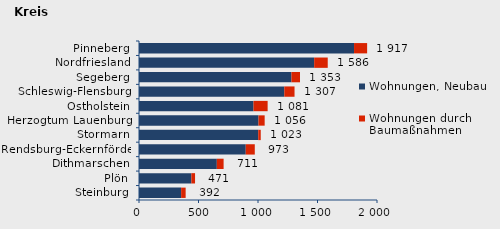
| Category | Wohnungen, Neubau | Wohnungen durch Baumaßnahmen | Series 2 |
|---|---|---|---|
| Steinburg | 354 | 38 | 392 |
| Plön | 440 | 31 | 471 |
| Dithmarschen | 654 | 57 | 711 |
| Rendsburg-Eckernförde | 897 | 76 | 973 |
| Stormarn | 1002 | 21 | 1023 |
| Herzogtum Lauenburg | 1004 | 52 | 1056 |
| Ostholstein | 962 | 119 | 1081 |
| Schleswig-Flensburg | 1221 | 86 | 1307 |
| Segeberg | 1281 | 72 | 1353 |
| Nordfriesland | 1472 | 114 | 1586 |
| Pinneberg | 1807 | 110 | 1917 |